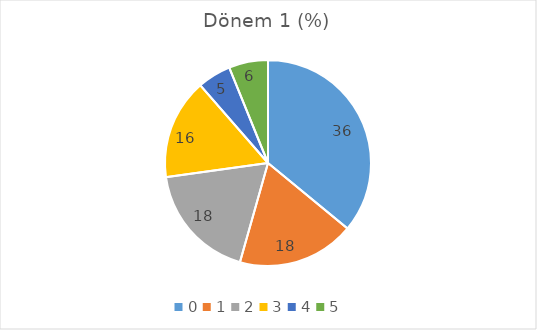
| Category | Dönem 1 (%) |
|---|---|
| 0.0 | 35.965 |
| 1.0 | 18.421 |
| 2.0 | 18.421 |
| 3.0 | 15.789 |
| 4.0 | 5.263 |
| 5.0 | 6.14 |